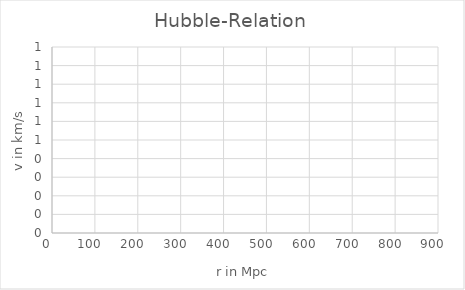
| Category | v in km/s |
|---|---|
| 209.0 | 0 |
| 229.0 | 0 |
| 190.0 | 0 |
| 524.0 | 0 |
| 794.0 | 0 |
| 380.0 | 0 |
| 251.0 | 0 |
| 288.0 | 0 |
| 60.2 | 0 |
| 50.0 | 0 |
| 105.0 | 0 |
| 138.0 | 0 |
| 120.0 | 0 |